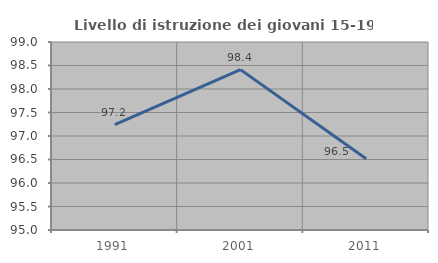
| Category | Livello di istruzione dei giovani 15-19 anni |
|---|---|
| 1991.0 | 97.243 |
| 2001.0 | 98.413 |
| 2011.0 | 96.515 |